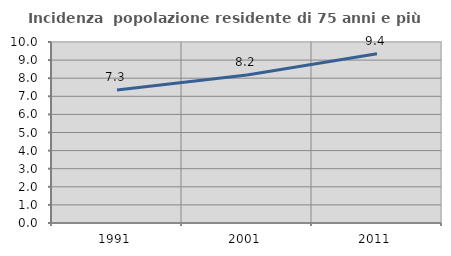
| Category | Incidenza  popolazione residente di 75 anni e più |
|---|---|
| 1991.0 | 7.346 |
| 2001.0 | 8.18 |
| 2011.0 | 9.351 |